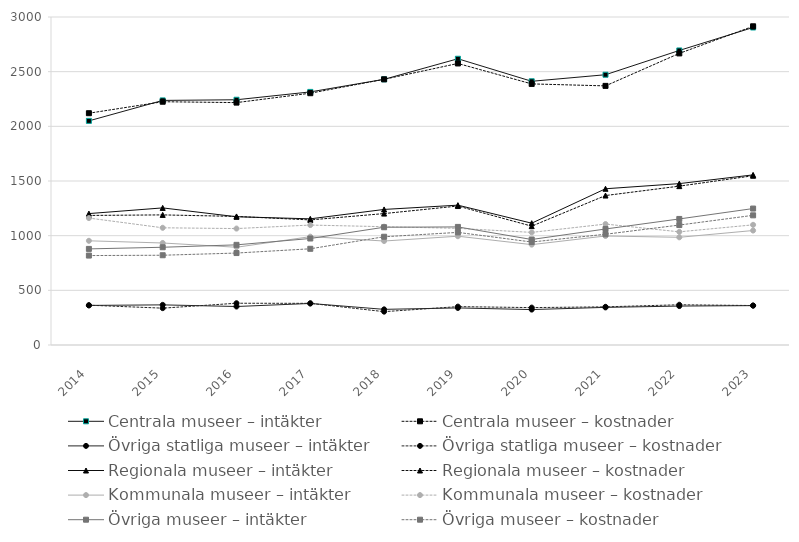
| Category | Centrala museer – intäkter | Centrala museer – kostnader | Övriga statliga museer – intäkter | Övriga statliga museer – kostnader | Regionala museer – intäkter | Regionala museer – kostnader | Kommunala museer – intäkter | Kommunala museer – kostnader | Övriga museer – intäkter | Övriga museer – kostnader |
|---|---|---|---|---|---|---|---|---|---|---|
| 2014 | 2050 | 2120 | 362 | 364 | 1202 | 1185 | 953 | 1161 | 879 | 818 |
| 2015 | 2237 | 2225 | 367 | 337 | 1254 | 1190 | 933 | 1072 | 894 | 821 |
| 2016 | 2243 | 2217 | 352 | 382 | 1173 | 1176 | 894 | 1065 | 916 | 841 |
| 2017 | 2315 | 2303 | 380 | 381 | 1154 | 1144 | 991 | 1097 | 974 | 880 |
| 2018 | 2430 | 2430 | 326 | 305 | 1240 | 1202 | 951 | 1082 | 1077 | 990 |
| 2019 | 2618 | 2575 | 339 | 351 | 1279 | 1271 | 995 | 1067 | 1080 | 1030 |
| 2020 | 2412 | 2388 | 324 | 342 | 1114 | 1087 | 918 | 1030 | 965 | 942 |
| 2021 | 2472 | 2370 | 344 | 349 | 1429 | 1367 | 997 | 1106 | 1061 | 1013 |
| 2022 | 2694 | 2667 | 356 | 368 | 1476 | 1453 | 985 | 1035 | 1153 | 1097 |
| 2023 | 2904 | 2915 | 360 | 361 | 1556 | 1548 | 1047 | 1099 | 1248 | 1186 |